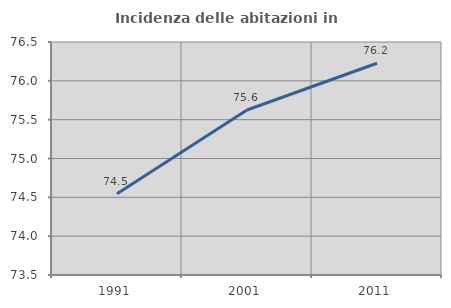
| Category | Incidenza delle abitazioni in proprietà  |
|---|---|
| 1991.0 | 74.547 |
| 2001.0 | 75.624 |
| 2011.0 | 76.226 |